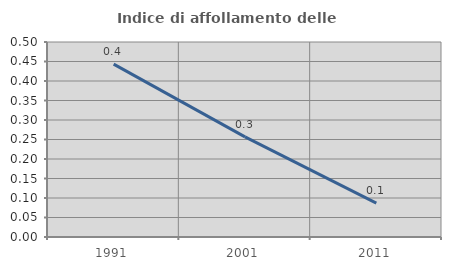
| Category | Indice di affollamento delle abitazioni  |
|---|---|
| 1991.0 | 0.443 |
| 2001.0 | 0.257 |
| 2011.0 | 0.087 |